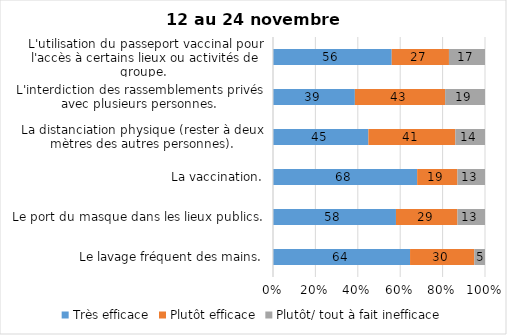
| Category | Très efficace | Plutôt efficace | Plutôt/ tout à fait inefficace |
|---|---|---|---|
| Le lavage fréquent des mains. | 64 | 30 | 5 |
| Le port du masque dans les lieux publics. | 58 | 29 | 13 |
| La vaccination. | 68 | 19 | 13 |
| La distanciation physique (rester à deux mètres des autres personnes). | 45 | 41 | 14 |
| L'interdiction des rassemblements privés avec plusieurs personnes. | 39 | 43 | 19 |
| L'utilisation du passeport vaccinal pour l'accès à certains lieux ou activités de groupe.  | 56 | 27 | 17 |